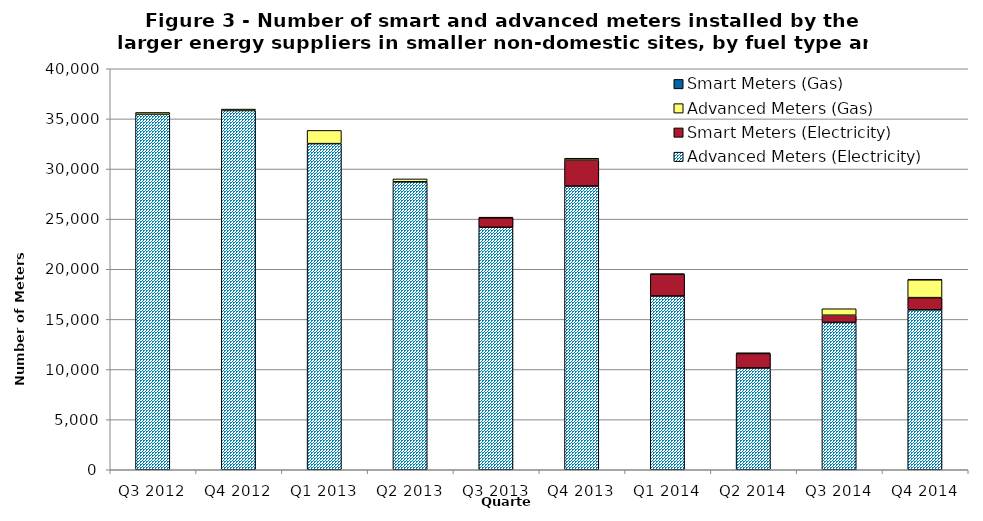
| Category | Advanced Meters (Electricity)  | Smart Meters (Electricity) | Advanced Meters (Gas) | Smart Meters (Gas) |
|---|---|---|---|---|
| Q3 2012 | 35455 | 0 | 186 | 0 |
| Q4 2012 | 35834 | 0 | 144 | 0 |
| Q1 2013 | 32529 | 0 | 1321 | 0 |
| Q2 2013 | 28722 | 0 | 290 | 0 |
| Q3 2013 | 24189 | 946 | 60 | 0 |
| Q4 2013 | 28300 | 2590 | 184 | 0 |
| Q1 2014 | 17332 | 2175 | 24 | 0 |
| Q2 2014 | 10152 | 1445 | 59 | 0 |
| Q3 2014 | 14700 | 714 | 647 | 0 |
| Q4 2014 | 15955 | 1214 | 1786 | 30 |